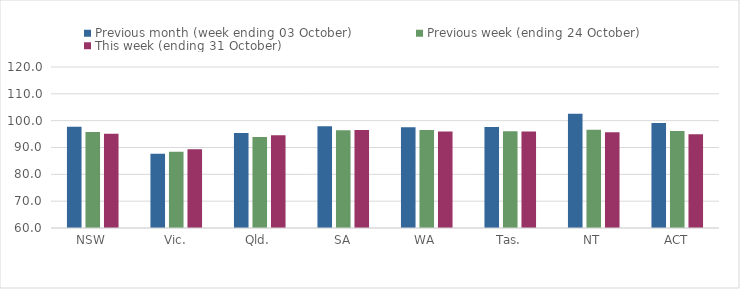
| Category | Previous month (week ending 03 October) | Previous week (ending 24 October) | This week (ending 31 October) |
|---|---|---|---|
| NSW | 97.72 | 95.81 | 95.15 |
| Vic. | 87.68 | 88.43 | 89.33 |
| Qld. | 95.38 | 93.87 | 94.54 |
| SA | 97.9 | 96.47 | 96.54 |
| WA | 97.54 | 96.52 | 95.96 |
| Tas. | 97.62 | 96.1 | 95.92 |
| NT | 102.6 | 96.63 | 95.65 |
| ACT | 99.12 | 96.18 | 94.95 |